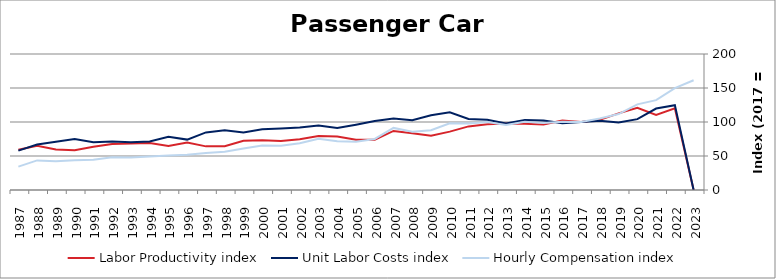
| Category | Labor Productivity index | Unit Labor Costs index | Hourly Compensation index |
|---|---|---|---|
| 2023.0 | 0 | 0 | 161.44 |
| 2022.0 | 120.065 | 124.78 | 149.817 |
| 2021.0 | 110.317 | 119.811 | 132.173 |
| 2020.0 | 120.877 | 104.19 | 125.942 |
| 2019.0 | 112.702 | 99.132 | 111.723 |
| 2018.0 | 103.193 | 101.79 | 105.04 |
| 2017.0 | 100 | 100 | 100 |
| 2016.0 | 102.069 | 98.29 | 100.323 |
| 2015.0 | 96.333 | 102.143 | 98.397 |
| 2014.0 | 97.263 | 103.075 | 100.254 |
| 2013.0 | 97.749 | 97.888 | 95.684 |
| 2012.0 | 96.733 | 103.386 | 100.009 |
| 2011.0 | 93.544 | 104.549 | 97.8 |
| 2010.0 | 85.844 | 114.26 | 98.085 |
| 2009.0 | 79.955 | 109.878 | 87.853 |
| 2008.0 | 83.498 | 102.656 | 85.716 |
| 2007.0 | 86.824 | 105.176 | 91.318 |
| 2006.0 | 74.057 | 101.392 | 75.088 |
| 2005.0 | 73.834 | 96.061 | 70.925 |
| 2004.0 | 78.591 | 91.045 | 71.553 |
| 2003.0 | 79.409 | 94.702 | 75.201 |
| 2002.0 | 74.794 | 91.953 | 68.776 |
| 2001.0 | 72.087 | 90.389 | 65.159 |
| 2000.0 | 73.039 | 89.401 | 65.297 |
| 1999.0 | 72.335 | 84.46 | 61.094 |
| 1998.0 | 64.317 | 87.697 | 56.404 |
| 1997.0 | 64.175 | 84.657 | 54.329 |
| 1996.0 | 69.944 | 74.098 | 51.827 |
| 1995.0 | 64.799 | 78.221 | 50.687 |
| 1994.0 | 69.089 | 71.448 | 49.363 |
| 1993.0 | 68.249 | 70.095 | 47.839 |
| 1992.0 | 67.742 | 71.179 | 48.218 |
| 1991.0 | 63.562 | 70.203 | 44.623 |
| 1990.0 | 58.631 | 74.825 | 43.871 |
| 1989.0 | 59.563 | 70.826 | 42.186 |
| 1988.0 | 64.98 | 66.959 | 43.51 |
| 1987.0 | 59.334 | 57.888 | 34.347 |